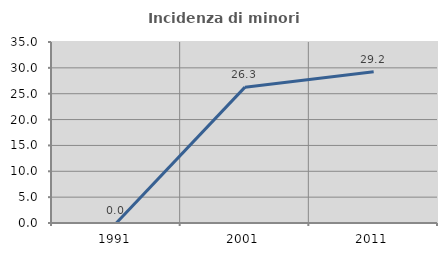
| Category | Incidenza di minori stranieri |
|---|---|
| 1991.0 | 0 |
| 2001.0 | 26.271 |
| 2011.0 | 29.246 |